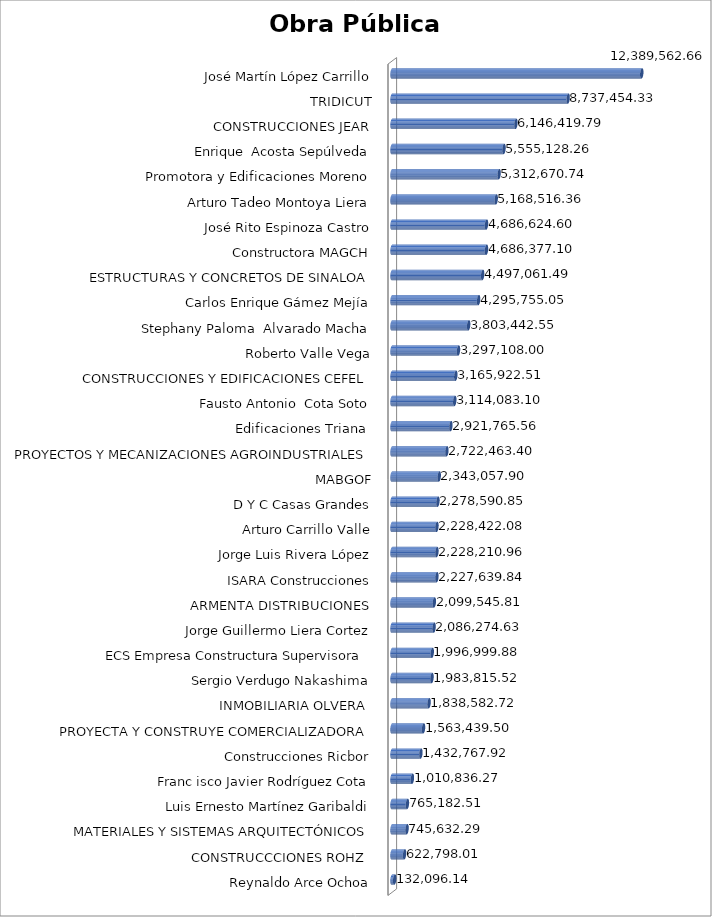
| Category | Monto  |
|---|---|
| Reynaldo Arce Ochoa | 132096.14 |
| CONSTRUCCCIONES ROHZ  | 622798.01 |
| MATERIALES Y SISTEMAS ARQUITECTÓNICOS | 745632.29 |
| Luis Ernesto Martínez Garibaldi | 765182.51 |
| Franc isco Javier Rodríguez Cota | 1010836.27 |
| Construcciones Ricbor | 1432767.92 |
| PROYECTA Y CONSTRUYE COMERCIALIZADORA | 1563439.5 |
| INMOBILIARIA OLVERA  | 1838582.72 |
| Sergio Verdugo Nakashima | 1983815.52 |
| ECS Empresa Constructura Supervisora  | 1996999.88 |
| Jorge Guillermo Liera Cortez | 2086274.63 |
| ARMENTA DISTRIBUCIONES | 2099545.81 |
| ISARA Construcciones | 2227639.84 |
| Jorge Luis Rivera López | 2228210.96 |
| Arturo Carrillo Valle | 2228422.08 |
| D Y C Casas Grandes | 2278590.85 |
| MABGOF | 2343057.9 |
| PROYECTOS Y MECANIZACIONES AGROINDUSTRIALES | 2722463.4 |
| Edificaciones Triana  | 2921765.56 |
| Fausto Antonio  Cota Soto | 3114083.1 |
| CONSTRUCCIONES Y EDIFICACIONES CEFEL | 3165922.51 |
| Roberto Valle Vega | 3297108 |
| Stephany Paloma  Alvarado Macha | 3803442.55 |
| Carlos Enrique Gámez Mejía | 4295755.05 |
| ESTRUCTURAS Y CONCRETOS DE SINALOA | 4497061.49 |
| Constructora MAGCH | 4686377.1 |
| José Rito Espinoza Castro | 4686624.6 |
| Arturo Tadeo Montoya Liera | 5168516.36 |
| Promotora y Edificaciones Moreno | 5312670.74 |
| Enrique  Acosta Sepúlveda | 5555128.26 |
| CONSTRUCCIONES JEAR | 6146419.79 |
| TRIDICUT | 8737454.33 |
| José Martín López Carrillo | 12389562.66 |